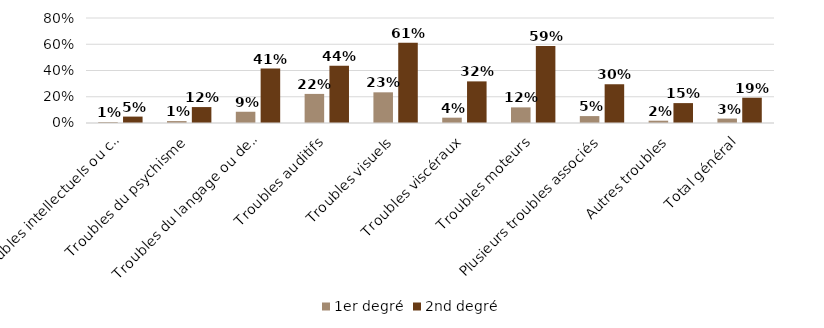
| Category | 1er degré | 2nd degré |
|---|---|---|
| Troubles intellectuels ou cognitifs | 0.007 | 0.049 |
| Troubles du psychisme | 0.015 | 0.121 |
| Troubles du langage ou de la parole | 0.086 | 0.415 |
| Troubles auditifs | 0.222 | 0.437 |
| Troubles visuels | 0.234 | 0.612 |
| Troubles viscéraux | 0.041 | 0.317 |
| Troubles moteurs | 0.119 | 0.586 |
| Plusieurs troubles associés | 0.053 | 0.295 |
| Autres troubles | 0.018 | 0.152 |
| Total général | 0.034 | 0.193 |